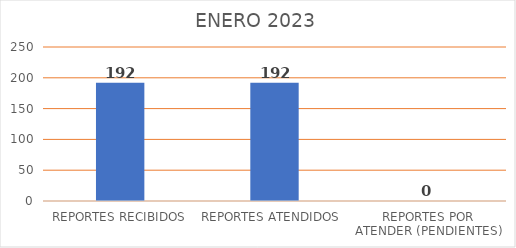
| Category | Series 0 |
|---|---|
| REPORTES RECIBIDOS | 192 |
| REPORTES ATENDIDOS  | 192 |
| REPORTES POR ATENDER (PENDIENTES) | 0 |